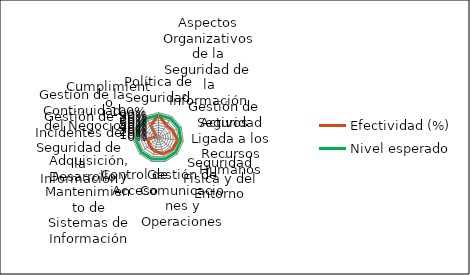
| Category | Efectividad (%) | Máx | Nivel esperado |
|---|---|---|---|
| Política de Seguridad | 0.91 |  | 0.9 |
| Aspectos Organizativos de la Seguridad de la Información | 0.581 |  | 0.9 |
| Gestión de Activos | 0.629 |  | 0.9 |
| Seguridad Ligada a los Recursos Humanos | 0.779 |  | 0.9 |
| Seguridad Física y del Entorno | 0.729 |  | 0.9 |
| Gestión de Comunicaciones y Operaciones | 0.682 |  | 0.9 |
| Control de Acceso | 0.561 |  | 0.9 |
| Adquisición, Desarrollo y Mantenimiento de Sistemas de Información | 0.481 |  | 0.9 |
| Gestión de Incidentes de Seguridad de la Información | 0.438 |  | 0.9 |
| Gestión de la Continuidad del Negocio | 0.08 |  | 0.9 |
| Cumplimiento | 0.572 |  | 0.9 |